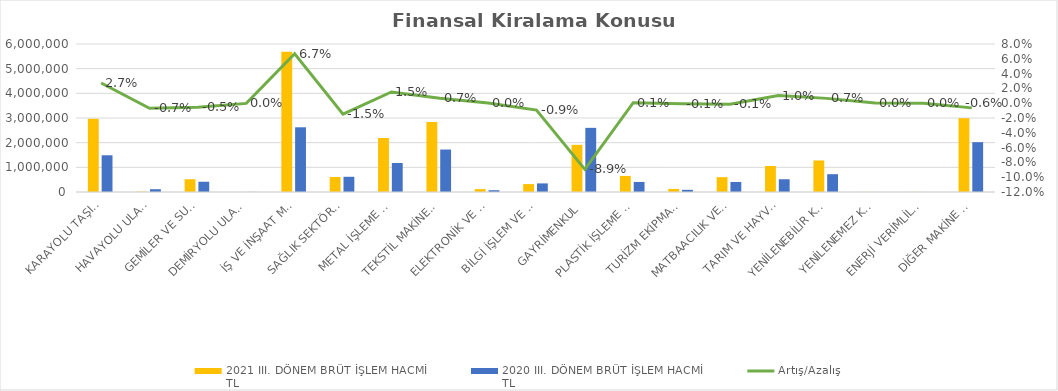
| Category | 2021 III. DÖNEM BRÜT İŞLEM HACMİ 
TL | 2020 III. DÖNEM BRÜT İŞLEM HACMİ 
TL |
|---|---|---|
| KARAYOLU TAŞITLARI | 2967853.993 | 1488810.758 |
| HAVAYOLU ULAŞIM ARAÇLARI | 12757 | 113499.207 |
| GEMİLER VE SUDA YÜZEN TAŞIT VE ARAÇLAR | 516931.098 | 416188.616 |
| DEMİRYOLU ULAŞIM ARAÇLARI | 293 | 3781 |
| İŞ VE İNŞAAT MAKİNELERİ | 5680976.457 | 2623689.067 |
| SAĞLIK SEKTÖRÜ VE ESTETİK EKİPMANLARI | 609011.559 | 616710.87 |
| METAL İŞLEME MAKİNELERİ | 2190474.218 | 1175092.775 |
| TEKSTİL MAKİNELERİ | 2839234.288 | 1721055.689 |
| ELEKTRONİK VE OPTİK CİHAZLAR | 117560.782 | 72000.007 |
| BİLGİ İŞLEM VE BÜRO SİSTEMLERİ | 321937.527 | 348593.729 |
| GAYRİMENKUL | 1912992.305 | 2600656.177 |
| PLASTİK İŞLEME MAKİNELERİ | 651604.318 | 407600.657 |
| TURİZM EKİPMANLARI | 123802.974 | 88821.705 |
| MATBAACILIK VE KAĞIT İŞLEME MAKİNELERİ | 602172.452 | 406822.803 |
| TARIM VE HAYVANCILIK MAKİNELERİ | 1053192.501 | 517190.887 |
| YENİLENEBİLİR KAYNAKLI ELEKTRİK ENERJİSİ ÜRETİM EKİPMANLARI | 1279280.813 | 721871.102 |
| YENİLENEMEZ KAYNAKLI ELEKTRİK ENERJİSİ ÜRETİM EKİPMANLARI | 2857 | 0 |
| ENERJİ VERİMLİLİĞİ EKİPMANLARI | 3661.684 | 1202.74 |
| DİĞER MAKİNE VE EKİPMANLAR | 2992170.921 | 2019603.435 |